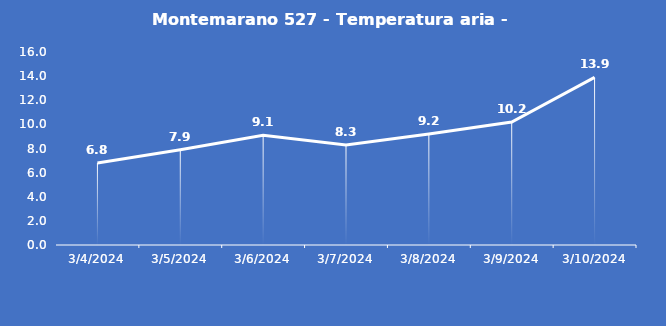
| Category | Montemarano 527 - Temperatura aria - Grezzo (°C) |
|---|---|
| 3/4/24 | 6.8 |
| 3/5/24 | 7.9 |
| 3/6/24 | 9.1 |
| 3/7/24 | 8.3 |
| 3/8/24 | 9.2 |
| 3/9/24 | 10.2 |
| 3/10/24 | 13.9 |